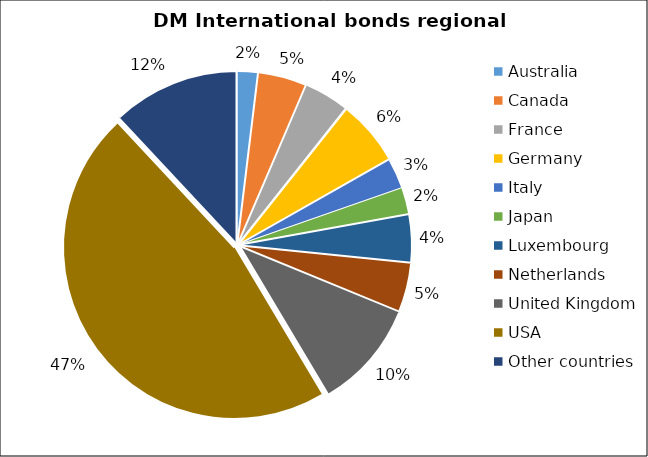
| Category | Series 0 |
|---|---|
| Australia | 336.379 |
| Canada | 792.53 |
| France | 743.864 |
| Germany | 1070.368 |
| Italy | 501.97 |
| Japan | 437.741 |
| Luxembourg | 782.067 |
| Netherlands | 803.352 |
| United Kingdom | 1798.472 |
| USA | 8167.771 |
| Other countries | 2096.06 |